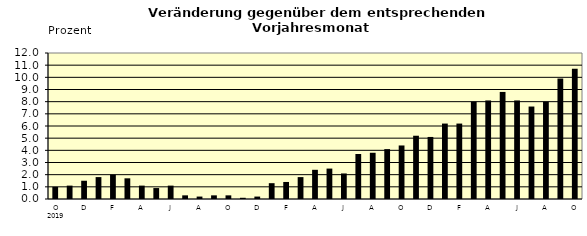
| Category | Series 0 |
|---|---|
| 0 | 1 |
| 1 | 1.1 |
| 2 | 1.5 |
| 3 | 1.8 |
| 4 | 2 |
| 5 | 1.7 |
| 6 | 1.1 |
| 7 | 0.9 |
| 8 | 1.1 |
| 9 | 0.3 |
| 10 | 0.2 |
| 11 | 0.3 |
| 12 | 0.3 |
| 13 | 0.1 |
| 14 | 0.2 |
| 15 | 1.3 |
| 16 | 1.4 |
| 17 | 1.8 |
| 18 | 2.4 |
| 19 | 2.5 |
| 20 | 2.1 |
| 21 | 3.7 |
| 22 | 3.8 |
| 23 | 4.1 |
| 24 | 4.4 |
| 25 | 5.2 |
| 26 | 5.1 |
| 27 | 6.2 |
| 28 | 6.2 |
| 29 | 8 |
| 30 | 8.1 |
| 31 | 8.8 |
| 32 | 8.1 |
| 33 | 7.6 |
| 34 | 8 |
| 35 | 9.9 |
| 36 | 10.7 |